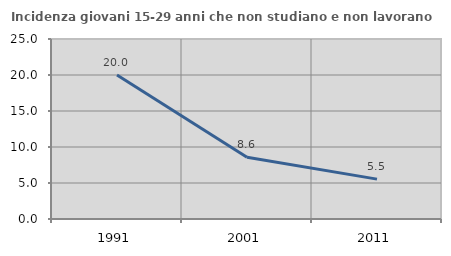
| Category | Incidenza giovani 15-29 anni che non studiano e non lavorano  |
|---|---|
| 1991.0 | 20 |
| 2001.0 | 8.571 |
| 2011.0 | 5.537 |